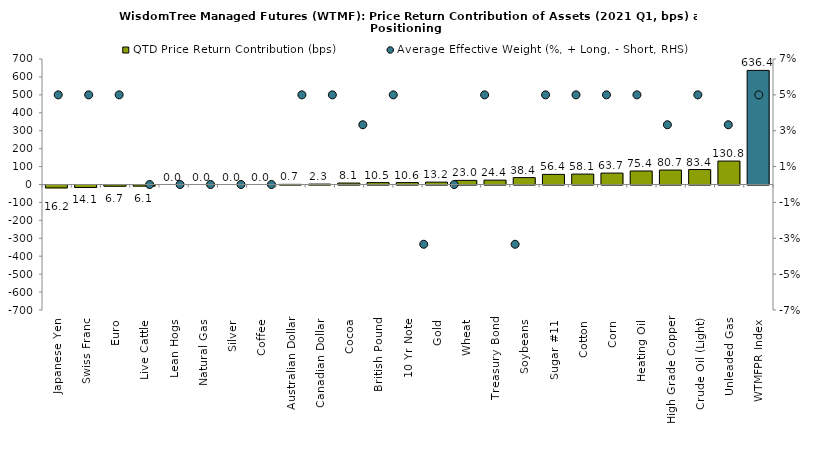
| Category | QTD Price Return Contribution (bps) |
|---|---|
| Japanese Yen | -16.172 |
| Swiss Franc | -14.115 |
| Euro | -6.737 |
| Live Cattle | -6.091 |
| Lean Hogs | 0 |
| Natural Gas | 0 |
| Silver | 0 |
| Coffee | 0 |
| Australian Dollar | 0.714 |
| Canadian Dollar | 2.276 |
| Cocoa | 8.066 |
| British Pound | 10.478 |
| 10 Yr Note | 10.609 |
| Gold | 13.218 |
| Wheat | 23.017 |
| Treasury Bond | 24.384 |
| Soybeans | 38.386 |
| Sugar #11 | 56.449 |
| Cotton | 58.054 |
| Corn | 63.676 |
| Heating Oil | 75.375 |
| High Grade Copper | 80.652 |
| Crude Oil (Light) | 83.43 |
| Unleaded Gas | 130.755 |
| WTMFPR Index | 636.425 |